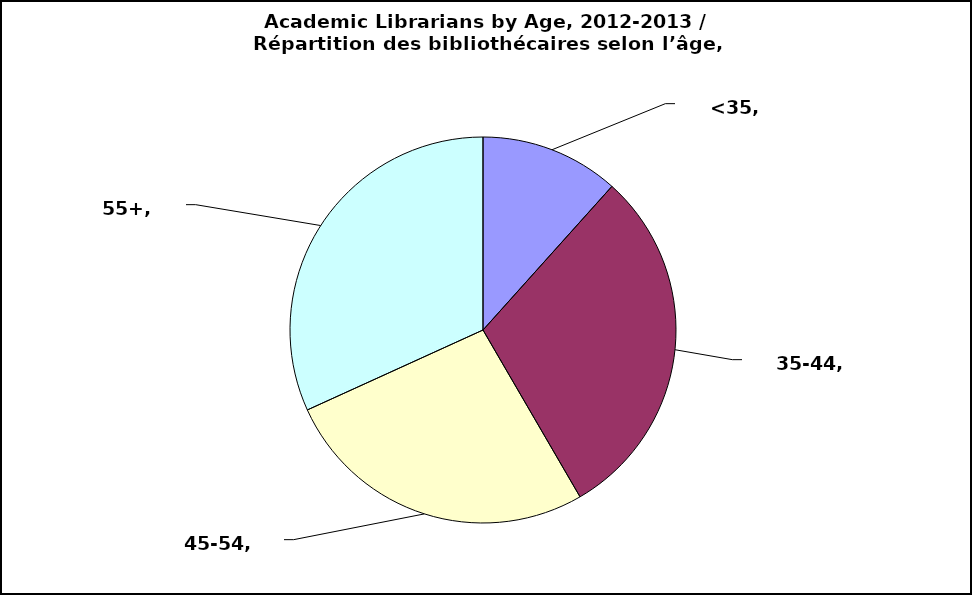
| Category | Series 0 |
|---|---|
| <35 | 0.116 |
| 35-44 | 0.3 |
| 45-54 | 0.266 |
| 55+ | 0.318 |